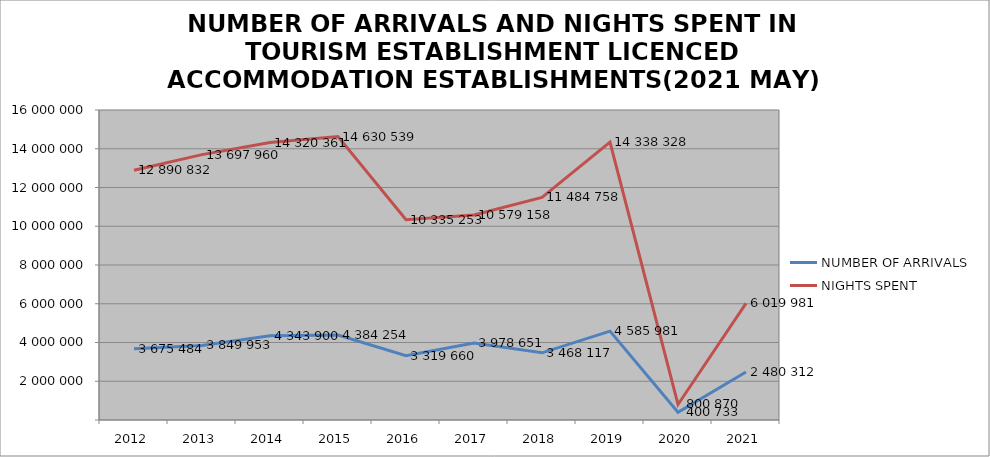
| Category | NUMBER OF ARRIVALS | NIGHTS SPENT |
|---|---|---|
| 2012 | 3675484 | 12890832 |
| 2013 | 3849953 | 13697960 |
| 2014 | 4343900 | 14320361 |
| 2015 | 4384254 | 14630539 |
| 2016 | 3319660 | 10335253 |
| 2017 | 3978651 | 10579158 |
| 2018 | 3468117 | 11484758 |
| 2019 | 4585981 | 14338328 |
| 2020 | 400733 | 800870 |
| 2021 | 2480312 | 6019981 |